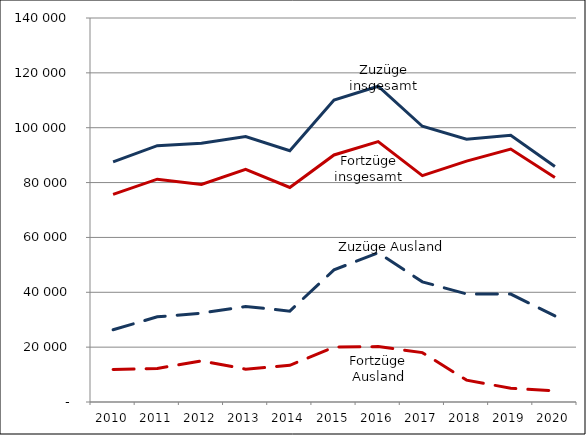
| Category | Zuzüge insgesamt | Zuzüge Ausland | Fortzüge insgesamt | Fortzüge Ausland |
|---|---|---|---|---|
| 2010.0 | 87538 | 26324 | 75668 | 11870 |
| 2011.0 | 93466 | 31048 | 81231 | 12235 |
| 2012.0 | 94346 | 32412 | 79335 | 15011 |
| 2013.0 | 96782 | 34839 | 84823 | 11959 |
| 2014.0 | 91594 | 33131 | 78218 | 13376 |
| 2015.0 | 110070 | 48173 | 90072 | 19998 |
| 2016.0 | 115115 | 54438 | 94914 | 20201 |
| 2017.0 | 100534 | 43809 | 82525 | 18009 |
| 2018.0 | 95790 | 39392 | 87811 | 7979 |
| 2019.0 | 97239 | 39348 | 92236 | 5003 |
| 2020.0 | 85885 | 31407 | 81828 | 4057 |